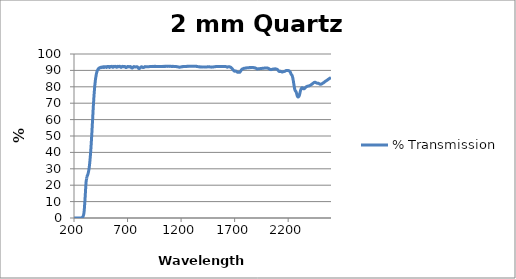
| Category | % Transmission |
|---|---|
| 2600.0 | 85.614 |
| 2599.0 | 85.567 |
| 2598.0 | 85.553 |
| 2597.0 | 85.533 |
| 2596.0 | 85.488 |
| 2595.0 | 85.441 |
| 2594.0 | 85.409 |
| 2593.0 | 85.367 |
| 2592.0 | 85.306 |
| 2591.0 | 85.269 |
| 2590.0 | 85.24 |
| 2589.0 | 85.201 |
| 2588.0 | 85.133 |
| 2587.0 | 85.096 |
| 2586.0 | 85.065 |
| 2585.0 | 85.046 |
| 2584.0 | 85.014 |
| 2583.0 | 84.96 |
| 2582.0 | 84.914 |
| 2581.0 | 84.849 |
| 2580.0 | 84.813 |
| 2579.0 | 84.771 |
| 2578.0 | 84.717 |
| 2577.0 | 84.67 |
| 2576.0 | 84.656 |
| 2575.0 | 84.606 |
| 2574.0 | 84.529 |
| 2573.0 | 84.483 |
| 2572.0 | 84.449 |
| 2571.0 | 84.373 |
| 2570.0 | 84.314 |
| 2569.0 | 84.259 |
| 2568.0 | 84.216 |
| 2567.0 | 84.174 |
| 2566.0 | 84.167 |
| 2565.0 | 84.11 |
| 2564.0 | 84.052 |
| 2563.0 | 84.034 |
| 2562.0 | 83.957 |
| 2561.0 | 83.891 |
| 2560.0 | 83.846 |
| 2559.0 | 83.817 |
| 2558.0 | 83.783 |
| 2557.0 | 83.774 |
| 2556.0 | 83.711 |
| 2555.0 | 83.677 |
| 2554.0 | 83.659 |
| 2553.0 | 83.614 |
| 2552.0 | 83.568 |
| 2551.0 | 83.537 |
| 2550.0 | 83.486 |
| 2549.0 | 83.431 |
| 2548.0 | 83.375 |
| 2547.0 | 83.309 |
| 2546.0 | 83.262 |
| 2545.0 | 83.224 |
| 2544.0 | 83.186 |
| 2543.0 | 83.152 |
| 2542.0 | 83.093 |
| 2541.0 | 83.016 |
| 2540.0 | 82.946 |
| 2539.0 | 82.89 |
| 2538.0 | 82.818 |
| 2537.0 | 82.803 |
| 2536.0 | 82.773 |
| 2535.0 | 82.689 |
| 2534.0 | 82.65 |
| 2533.0 | 82.607 |
| 2532.0 | 82.536 |
| 2531.0 | 82.507 |
| 2530.0 | 82.496 |
| 2529.0 | 82.452 |
| 2528.0 | 82.372 |
| 2527.0 | 82.332 |
| 2526.0 | 82.344 |
| 2525.0 | 82.303 |
| 2524.0 | 82.262 |
| 2523.0 | 82.205 |
| 2522.0 | 82.153 |
| 2521.0 | 82.114 |
| 2520.0 | 82.059 |
| 2519.0 | 82.009 |
| 2518.0 | 81.981 |
| 2517.0 | 81.955 |
| 2516.0 | 81.899 |
| 2515.0 | 81.85 |
| 2514.0 | 81.815 |
| 2513.0 | 81.774 |
| 2512.0 | 81.739 |
| 2511.0 | 81.691 |
| 2510.0 | 81.64 |
| 2509.0 | 81.621 |
| 2508.0 | 81.596 |
| 2507.0 | 81.584 |
| 2506.0 | 81.559 |
| 2505.0 | 81.56 |
| 2504.0 | 81.524 |
| 2503.0 | 81.506 |
| 2502.0 | 81.507 |
| 2501.0 | 81.507 |
| 2500.0 | 81.535 |
| 2499.0 | 81.54 |
| 2498.0 | 81.558 |
| 2497.0 | 81.595 |
| 2496.0 | 81.614 |
| 2495.0 | 81.634 |
| 2494.0 | 81.683 |
| 2493.0 | 81.718 |
| 2492.0 | 81.761 |
| 2491.0 | 81.799 |
| 2490.0 | 81.839 |
| 2489.0 | 81.879 |
| 2488.0 | 81.925 |
| 2487.0 | 81.98 |
| 2486.0 | 82.029 |
| 2485.0 | 82.075 |
| 2484.0 | 82.114 |
| 2483.0 | 82.147 |
| 2482.0 | 82.171 |
| 2481.0 | 82.215 |
| 2480.0 | 82.214 |
| 2479.0 | 82.214 |
| 2478.0 | 82.208 |
| 2477.0 | 82.232 |
| 2476.0 | 82.234 |
| 2475.0 | 82.223 |
| 2474.0 | 82.209 |
| 2473.0 | 82.215 |
| 2472.0 | 82.221 |
| 2471.0 | 82.217 |
| 2470.0 | 82.222 |
| 2469.0 | 82.25 |
| 2468.0 | 82.264 |
| 2467.0 | 82.279 |
| 2466.0 | 82.281 |
| 2465.0 | 82.303 |
| 2464.0 | 82.335 |
| 2463.0 | 82.379 |
| 2462.0 | 82.414 |
| 2461.0 | 82.452 |
| 2460.0 | 82.515 |
| 2459.0 | 82.556 |
| 2458.0 | 82.599 |
| 2457.0 | 82.633 |
| 2456.0 | 82.664 |
| 2455.0 | 82.707 |
| 2454.0 | 82.738 |
| 2453.0 | 82.752 |
| 2452.0 | 82.768 |
| 2451.0 | 82.776 |
| 2450.0 | 82.786 |
| 2449.0 | 82.776 |
| 2448.0 | 82.754 |
| 2447.0 | 82.732 |
| 2446.0 | 82.721 |
| 2445.0 | 82.707 |
| 2444.0 | 82.668 |
| 2443.0 | 82.626 |
| 2442.0 | 82.597 |
| 2441.0 | 82.566 |
| 2440.0 | 82.529 |
| 2439.0 | 82.506 |
| 2438.0 | 82.451 |
| 2437.0 | 82.401 |
| 2436.0 | 82.345 |
| 2435.0 | 82.293 |
| 2434.0 | 82.244 |
| 2433.0 | 82.178 |
| 2432.0 | 82.113 |
| 2431.0 | 82.076 |
| 2430.0 | 82.045 |
| 2429.0 | 82.003 |
| 2428.0 | 81.947 |
| 2427.0 | 81.883 |
| 2426.0 | 81.83 |
| 2425.0 | 81.783 |
| 2424.0 | 81.714 |
| 2423.0 | 81.664 |
| 2422.0 | 81.626 |
| 2421.0 | 81.568 |
| 2420.0 | 81.499 |
| 2419.0 | 81.448 |
| 2418.0 | 81.411 |
| 2417.0 | 81.367 |
| 2416.0 | 81.322 |
| 2415.0 | 81.281 |
| 2414.0 | 81.24 |
| 2413.0 | 81.206 |
| 2412.0 | 81.163 |
| 2411.0 | 81.113 |
| 2410.0 | 81.073 |
| 2409.0 | 81.035 |
| 2408.0 | 80.98 |
| 2407.0 | 80.927 |
| 2406.0 | 80.899 |
| 2405.0 | 80.858 |
| 2404.0 | 80.806 |
| 2403.0 | 80.78 |
| 2402.0 | 80.764 |
| 2401.0 | 80.75 |
| 2400.0 | 80.726 |
| 2399.0 | 80.689 |
| 2398.0 | 80.661 |
| 2397.0 | 80.628 |
| 2396.0 | 80.6 |
| 2395.0 | 80.568 |
| 2394.0 | 80.548 |
| 2393.0 | 80.541 |
| 2392.0 | 80.528 |
| 2391.0 | 80.522 |
| 2390.0 | 80.516 |
| 2389.0 | 80.494 |
| 2388.0 | 80.484 |
| 2387.0 | 80.47 |
| 2386.0 | 80.45 |
| 2385.0 | 80.433 |
| 2384.0 | 80.42 |
| 2383.0 | 80.404 |
| 2382.0 | 80.385 |
| 2381.0 | 80.374 |
| 2380.0 | 80.358 |
| 2379.0 | 80.325 |
| 2378.0 | 80.305 |
| 2377.0 | 80.272 |
| 2376.0 | 80.248 |
| 2375.0 | 80.22 |
| 2374.0 | 80.187 |
| 2373.0 | 80.154 |
| 2372.0 | 80.114 |
| 2371.0 | 80.075 |
| 2370.0 | 80.037 |
| 2369.0 | 79.986 |
| 2368.0 | 79.923 |
| 2367.0 | 79.862 |
| 2366.0 | 79.812 |
| 2365.0 | 79.757 |
| 2364.0 | 79.707 |
| 2363.0 | 79.662 |
| 2362.0 | 79.591 |
| 2361.0 | 79.531 |
| 2360.0 | 79.472 |
| 2359.0 | 79.412 |
| 2358.0 | 79.339 |
| 2357.0 | 79.262 |
| 2356.0 | 79.187 |
| 2355.0 | 79.122 |
| 2354.0 | 79.057 |
| 2353.0 | 78.972 |
| 2352.0 | 78.922 |
| 2351.0 | 78.88 |
| 2350.0 | 78.84 |
| 2349.0 | 78.807 |
| 2348.0 | 78.776 |
| 2347.0 | 78.764 |
| 2346.0 | 78.775 |
| 2345.0 | 78.793 |
| 2344.0 | 78.819 |
| 2343.0 | 78.857 |
| 2342.0 | 78.897 |
| 2341.0 | 78.951 |
| 2340.0 | 79.015 |
| 2339.0 | 79.076 |
| 2338.0 | 79.145 |
| 2337.0 | 79.205 |
| 2336.0 | 79.278 |
| 2335.0 | 79.335 |
| 2334.0 | 79.374 |
| 2333.0 | 79.428 |
| 2332.0 | 79.461 |
| 2331.0 | 79.448 |
| 2330.0 | 79.45 |
| 2329.0 | 79.439 |
| 2328.0 | 79.384 |
| 2327.0 | 79.304 |
| 2326.0 | 79.233 |
| 2325.0 | 79.158 |
| 2324.0 | 79.063 |
| 2323.0 | 78.947 |
| 2322.0 | 78.795 |
| 2321.0 | 78.634 |
| 2320.0 | 78.477 |
| 2319.0 | 78.323 |
| 2318.0 | 78.164 |
| 2317.0 | 77.981 |
| 2316.0 | 77.787 |
| 2315.0 | 77.562 |
| 2314.0 | 77.328 |
| 2313.0 | 77.095 |
| 2312.0 | 76.825 |
| 2311.0 | 76.532 |
| 2310.0 | 76.237 |
| 2309.0 | 75.963 |
| 2308.0 | 75.708 |
| 2307.0 | 75.42 |
| 2306.0 | 75.173 |
| 2305.0 | 74.923 |
| 2304.0 | 74.712 |
| 2303.0 | 74.514 |
| 2302.0 | 74.376 |
| 2301.0 | 74.231 |
| 2300.0 | 74.111 |
| 2299.0 | 74.02 |
| 2298.0 | 73.954 |
| 2297.0 | 73.89 |
| 2296.0 | 73.844 |
| 2295.0 | 73.802 |
| 2294.0 | 73.802 |
| 2293.0 | 73.792 |
| 2292.0 | 73.803 |
| 2291.0 | 73.839 |
| 2290.0 | 73.892 |
| 2289.0 | 73.947 |
| 2288.0 | 74.035 |
| 2287.0 | 74.132 |
| 2286.0 | 74.269 |
| 2285.0 | 74.428 |
| 2284.0 | 74.611 |
| 2283.0 | 74.841 |
| 2282.0 | 75.067 |
| 2281.0 | 75.31 |
| 2280.0 | 75.572 |
| 2279.0 | 75.842 |
| 2278.0 | 76.09 |
| 2277.0 | 76.343 |
| 2276.0 | 76.568 |
| 2275.0 | 76.755 |
| 2274.0 | 76.942 |
| 2273.0 | 77.082 |
| 2272.0 | 77.202 |
| 2271.0 | 77.308 |
| 2270.0 | 77.39 |
| 2269.0 | 77.448 |
| 2268.0 | 77.504 |
| 2267.0 | 77.584 |
| 2266.0 | 77.683 |
| 2265.0 | 77.805 |
| 2264.0 | 77.972 |
| 2263.0 | 78.133 |
| 2262.0 | 78.36 |
| 2261.0 | 78.61 |
| 2260.0 | 78.889 |
| 2259.0 | 79.245 |
| 2258.0 | 79.585 |
| 2257.0 | 79.981 |
| 2256.0 | 80.369 |
| 2255.0 | 80.781 |
| 2254.0 | 81.17 |
| 2253.0 | 81.617 |
| 2252.0 | 82.031 |
| 2251.0 | 82.445 |
| 2250.0 | 82.866 |
| 2249.0 | 83.272 |
| 2248.0 | 83.648 |
| 2247.0 | 84.019 |
| 2246.0 | 84.388 |
| 2245.0 | 84.823 |
| 2244.0 | 85.151 |
| 2243.0 | 85.458 |
| 2242.0 | 85.762 |
| 2241.0 | 86.006 |
| 2240.0 | 86.222 |
| 2239.0 | 86.47 |
| 2238.0 | 86.65 |
| 2237.0 | 86.816 |
| 2236.0 | 86.956 |
| 2235.0 | 87.064 |
| 2234.0 | 87.147 |
| 2233.0 | 87.213 |
| 2232.0 | 87.281 |
| 2231.0 | 87.389 |
| 2230.0 | 87.475 |
| 2229.0 | 87.577 |
| 2228.0 | 87.659 |
| 2227.0 | 87.819 |
| 2226.0 | 87.971 |
| 2225.0 | 88.121 |
| 2224.0 | 88.291 |
| 2223.0 | 88.451 |
| 2222.0 | 88.585 |
| 2221.0 | 88.721 |
| 2220.0 | 88.843 |
| 2219.0 | 88.972 |
| 2218.0 | 89.091 |
| 2217.0 | 89.19 |
| 2216.0 | 89.288 |
| 2215.0 | 89.356 |
| 2214.0 | 89.444 |
| 2213.0 | 89.48 |
| 2212.0 | 89.543 |
| 2211.0 | 89.622 |
| 2210.0 | 89.648 |
| 2209.0 | 89.722 |
| 2208.0 | 89.748 |
| 2207.0 | 89.779 |
| 2206.0 | 89.808 |
| 2205.0 | 89.829 |
| 2204.0 | 89.827 |
| 2203.0 | 89.858 |
| 2202.0 | 89.888 |
| 2201.0 | 89.911 |
| 2200.0 | 89.907 |
| 2199.0 | 89.936 |
| 2198.0 | 89.926 |
| 2197.0 | 89.925 |
| 2196.0 | 89.959 |
| 2195.0 | 89.977 |
| 2194.0 | 89.945 |
| 2193.0 | 89.96 |
| 2192.0 | 89.972 |
| 2191.0 | 89.943 |
| 2190.0 | 89.938 |
| 2189.0 | 89.938 |
| 2188.0 | 89.943 |
| 2187.0 | 89.913 |
| 2186.0 | 89.922 |
| 2185.0 | 89.893 |
| 2184.0 | 89.898 |
| 2183.0 | 89.883 |
| 2182.0 | 89.885 |
| 2181.0 | 89.877 |
| 2180.0 | 89.84 |
| 2179.0 | 89.839 |
| 2178.0 | 89.81 |
| 2177.0 | 89.794 |
| 2176.0 | 89.763 |
| 2175.0 | 89.696 |
| 2174.0 | 89.681 |
| 2173.0 | 89.621 |
| 2172.0 | 89.613 |
| 2171.0 | 89.525 |
| 2170.0 | 89.492 |
| 2169.0 | 89.462 |
| 2168.0 | 89.438 |
| 2167.0 | 89.443 |
| 2166.0 | 89.399 |
| 2165.0 | 89.372 |
| 2164.0 | 89.383 |
| 2163.0 | 89.388 |
| 2162.0 | 89.37 |
| 2161.0 | 89.323 |
| 2160.0 | 89.317 |
| 2159.0 | 89.304 |
| 2158.0 | 89.304 |
| 2157.0 | 89.274 |
| 2156.0 | 89.237 |
| 2155.0 | 89.209 |
| 2154.0 | 89.175 |
| 2153.0 | 89.184 |
| 2152.0 | 89.127 |
| 2151.0 | 89.116 |
| 2150.0 | 89.105 |
| 2149.0 | 89.066 |
| 2148.0 | 89.049 |
| 2147.0 | 89.057 |
| 2146.0 | 89.042 |
| 2145.0 | 89.033 |
| 2144.0 | 89.026 |
| 2143.0 | 89.013 |
| 2142.0 | 89.077 |
| 2141.0 | 89.084 |
| 2140.0 | 89.116 |
| 2139.0 | 89.138 |
| 2138.0 | 89.176 |
| 2137.0 | 89.222 |
| 2136.0 | 89.268 |
| 2135.0 | 89.279 |
| 2134.0 | 89.314 |
| 2133.0 | 89.337 |
| 2132.0 | 89.389 |
| 2131.0 | 89.412 |
| 2130.0 | 89.421 |
| 2129.0 | 89.443 |
| 2128.0 | 89.456 |
| 2127.0 | 89.453 |
| 2126.0 | 89.394 |
| 2125.0 | 89.399 |
| 2124.0 | 89.407 |
| 2123.0 | 89.408 |
| 2122.0 | 89.395 |
| 2121.0 | 89.404 |
| 2120.0 | 89.391 |
| 2119.0 | 89.385 |
| 2118.0 | 89.377 |
| 2117.0 | 89.394 |
| 2116.0 | 89.383 |
| 2115.0 | 89.423 |
| 2114.0 | 89.457 |
| 2113.0 | 89.498 |
| 2112.0 | 89.55 |
| 2111.0 | 89.622 |
| 2110.0 | 89.709 |
| 2109.0 | 89.802 |
| 2108.0 | 89.896 |
| 2107.0 | 89.994 |
| 2106.0 | 90.066 |
| 2105.0 | 90.15 |
| 2104.0 | 90.227 |
| 2103.0 | 90.321 |
| 2102.0 | 90.395 |
| 2101.0 | 90.434 |
| 2100.0 | 90.492 |
| 2099.0 | 90.553 |
| 2098.0 | 90.616 |
| 2097.0 | 90.651 |
| 2096.0 | 90.645 |
| 2095.0 | 90.687 |
| 2094.0 | 90.713 |
| 2093.0 | 90.752 |
| 2092.0 | 90.781 |
| 2091.0 | 90.775 |
| 2090.0 | 90.796 |
| 2089.0 | 90.837 |
| 2088.0 | 90.859 |
| 2087.0 | 90.881 |
| 2086.0 | 90.897 |
| 2085.0 | 90.887 |
| 2084.0 | 90.915 |
| 2083.0 | 90.924 |
| 2082.0 | 90.937 |
| 2081.0 | 90.959 |
| 2080.0 | 90.94 |
| 2079.0 | 90.937 |
| 2078.0 | 90.94 |
| 2077.0 | 90.966 |
| 2076.0 | 90.969 |
| 2075.0 | 90.926 |
| 2074.0 | 90.917 |
| 2073.0 | 90.925 |
| 2072.0 | 90.924 |
| 2071.0 | 90.924 |
| 2070.0 | 90.914 |
| 2069.0 | 90.9 |
| 2068.0 | 90.886 |
| 2067.0 | 90.893 |
| 2066.0 | 90.905 |
| 2065.0 | 90.874 |
| 2064.0 | 90.843 |
| 2063.0 | 90.855 |
| 2062.0 | 90.867 |
| 2061.0 | 90.859 |
| 2060.0 | 90.836 |
| 2059.0 | 90.806 |
| 2058.0 | 90.799 |
| 2057.0 | 90.793 |
| 2056.0 | 90.783 |
| 2055.0 | 90.729 |
| 2054.0 | 90.69 |
| 2053.0 | 90.69 |
| 2052.0 | 90.678 |
| 2051.0 | 90.642 |
| 2050.0 | 90.63 |
| 2049.0 | 90.604 |
| 2048.0 | 90.595 |
| 2047.0 | 90.585 |
| 2046.0 | 90.565 |
| 2045.0 | 90.535 |
| 2044.0 | 90.512 |
| 2043.0 | 90.509 |
| 2042.0 | 90.485 |
| 2041.0 | 90.473 |
| 2040.0 | 90.464 |
| 2039.0 | 90.451 |
| 2038.0 | 90.471 |
| 2037.0 | 90.48 |
| 2036.0 | 90.479 |
| 2035.0 | 90.488 |
| 2034.0 | 90.509 |
| 2033.0 | 90.523 |
| 2032.0 | 90.546 |
| 2031.0 | 90.578 |
| 2030.0 | 90.609 |
| 2029.0 | 90.653 |
| 2028.0 | 90.691 |
| 2027.0 | 90.754 |
| 2026.0 | 90.805 |
| 2025.0 | 90.835 |
| 2024.0 | 90.9 |
| 2023.0 | 90.946 |
| 2022.0 | 90.995 |
| 2021.0 | 91.036 |
| 2020.0 | 91.05 |
| 2019.0 | 91.078 |
| 2018.0 | 91.138 |
| 2017.0 | 91.184 |
| 2016.0 | 91.206 |
| 2015.0 | 91.242 |
| 2014.0 | 91.278 |
| 2013.0 | 91.3 |
| 2012.0 | 91.32 |
| 2011.0 | 91.326 |
| 2010.0 | 91.337 |
| 2009.0 | 91.361 |
| 2008.0 | 91.379 |
| 2007.0 | 91.41 |
| 2006.0 | 91.439 |
| 2005.0 | 91.446 |
| 2004.0 | 91.451 |
| 2003.0 | 91.456 |
| 2002.0 | 91.459 |
| 2001.0 | 91.478 |
| 2000.0 | 91.508 |
| 1999.0 | 91.518 |
| 1998.0 | 91.498 |
| 1997.0 | 91.502 |
| 1996.0 | 91.507 |
| 1995.0 | 91.49 |
| 1994.0 | 91.501 |
| 1993.0 | 91.495 |
| 1992.0 | 91.485 |
| 1991.0 | 91.456 |
| 1990.0 | 91.443 |
| 1989.0 | 91.457 |
| 1988.0 | 91.462 |
| 1987.0 | 91.458 |
| 1986.0 | 91.443 |
| 1985.0 | 91.428 |
| 1984.0 | 91.419 |
| 1983.0 | 91.406 |
| 1982.0 | 91.409 |
| 1981.0 | 91.408 |
| 1980.0 | 91.396 |
| 1979.0 | 91.388 |
| 1978.0 | 91.401 |
| 1977.0 | 91.399 |
| 1976.0 | 91.381 |
| 1975.0 | 91.377 |
| 1974.0 | 91.358 |
| 1973.0 | 91.352 |
| 1972.0 | 91.359 |
| 1971.0 | 91.368 |
| 1970.0 | 91.377 |
| 1969.0 | 91.372 |
| 1968.0 | 91.349 |
| 1967.0 | 91.331 |
| 1966.0 | 91.32 |
| 1965.0 | 91.328 |
| 1964.0 | 91.329 |
| 1963.0 | 91.3 |
| 1962.0 | 91.289 |
| 1961.0 | 91.288 |
| 1960.0 | 91.277 |
| 1959.0 | 91.255 |
| 1958.0 | 91.262 |
| 1957.0 | 91.25 |
| 1956.0 | 91.212 |
| 1955.0 | 91.197 |
| 1954.0 | 91.225 |
| 1953.0 | 91.189 |
| 1952.0 | 91.161 |
| 1951.0 | 91.16 |
| 1950.0 | 91.181 |
| 1949.0 | 91.156 |
| 1948.0 | 91.18 |
| 1947.0 | 91.174 |
| 1946.0 | 91.13 |
| 1945.0 | 91.137 |
| 1944.0 | 91.141 |
| 1943.0 | 91.13 |
| 1942.0 | 91.119 |
| 1941.0 | 91.12 |
| 1940.0 | 91.123 |
| 1939.0 | 91.08 |
| 1938.0 | 91.093 |
| 1937.0 | 91.096 |
| 1936.0 | 91.082 |
| 1935.0 | 91.067 |
| 1934.0 | 91.067 |
| 1933.0 | 91.053 |
| 1932.0 | 91.021 |
| 1931.0 | 91.024 |
| 1930.0 | 91.016 |
| 1929.0 | 90.984 |
| 1928.0 | 91.001 |
| 1927.0 | 90.985 |
| 1926.0 | 90.972 |
| 1925.0 | 90.972 |
| 1924.0 | 90.968 |
| 1923.0 | 90.972 |
| 1922.0 | 90.966 |
| 1921.0 | 90.967 |
| 1920.0 | 90.956 |
| 1919.0 | 90.955 |
| 1918.0 | 90.929 |
| 1917.0 | 90.924 |
| 1916.0 | 90.928 |
| 1915.0 | 90.91 |
| 1914.0 | 90.915 |
| 1913.0 | 90.92 |
| 1912.0 | 90.907 |
| 1911.0 | 90.903 |
| 1910.0 | 90.936 |
| 1909.0 | 90.968 |
| 1908.0 | 90.991 |
| 1907.0 | 91.013 |
| 1906.0 | 91.005 |
| 1905.0 | 91.044 |
| 1904.0 | 91.094 |
| 1903.0 | 91.118 |
| 1902.0 | 91.155 |
| 1901.0 | 91.185 |
| 1900.0 | 91.227 |
| 1899.0 | 91.28 |
| 1898.0 | 91.342 |
| 1897.0 | 91.37 |
| 1896.0 | 91.381 |
| 1895.0 | 91.414 |
| 1894.0 | 91.444 |
| 1893.0 | 91.51 |
| 1892.0 | 91.504 |
| 1891.0 | 91.487 |
| 1890.0 | 91.54 |
| 1889.0 | 91.569 |
| 1888.0 | 91.57 |
| 1887.0 | 91.593 |
| 1886.0 | 91.609 |
| 1885.0 | 91.646 |
| 1884.0 | 91.655 |
| 1883.0 | 91.658 |
| 1882.0 | 91.671 |
| 1881.0 | 91.683 |
| 1880.0 | 91.675 |
| 1879.0 | 91.681 |
| 1878.0 | 91.683 |
| 1877.0 | 91.706 |
| 1876.0 | 91.717 |
| 1875.0 | 91.711 |
| 1874.0 | 91.73 |
| 1873.0 | 91.694 |
| 1872.0 | 91.7 |
| 1871.0 | 91.715 |
| 1870.0 | 91.743 |
| 1869.0 | 91.739 |
| 1868.0 | 91.764 |
| 1867.0 | 91.816 |
| 1866.0 | 91.806 |
| 1865.0 | 91.792 |
| 1864.0 | 91.775 |
| 1863.0 | 91.788 |
| 1862.0 | 91.784 |
| 1861.0 | 91.771 |
| 1860.0 | 91.757 |
| 1859.0 | 91.724 |
| 1858.0 | 91.763 |
| 1857.0 | 91.764 |
| 1856.0 | 91.763 |
| 1855.0 | 91.743 |
| 1854.0 | 91.761 |
| 1853.0 | 91.751 |
| 1852.0 | 91.75 |
| 1851.0 | 91.735 |
| 1850.0 | 91.691 |
| 1849.0 | 91.733 |
| 1848.0 | 91.724 |
| 1847.0 | 91.715 |
| 1846.0 | 91.719 |
| 1845.0 | 91.75 |
| 1844.0 | 91.698 |
| 1843.0 | 91.673 |
| 1842.0 | 91.707 |
| 1841.0 | 91.685 |
| 1840.0 | 91.705 |
| 1839.0 | 91.72 |
| 1838.0 | 91.71 |
| 1837.0 | 91.669 |
| 1836.0 | 91.667 |
| 1835.0 | 91.658 |
| 1834.0 | 91.658 |
| 1833.0 | 91.663 |
| 1832.0 | 91.661 |
| 1831.0 | 91.663 |
| 1830.0 | 91.667 |
| 1829.0 | 91.664 |
| 1828.0 | 91.635 |
| 1827.0 | 91.66 |
| 1826.0 | 91.602 |
| 1825.0 | 91.64 |
| 1824.0 | 91.634 |
| 1823.0 | 91.6 |
| 1822.0 | 91.577 |
| 1821.0 | 91.587 |
| 1820.0 | 91.576 |
| 1819.0 | 91.583 |
| 1818.0 | 91.583 |
| 1817.0 | 91.587 |
| 1816.0 | 91.612 |
| 1815.0 | 91.564 |
| 1814.0 | 91.574 |
| 1813.0 | 91.543 |
| 1812.0 | 91.511 |
| 1811.0 | 91.504 |
| 1810.0 | 91.49 |
| 1809.0 | 91.505 |
| 1808.0 | 91.498 |
| 1807.0 | 91.46 |
| 1806.0 | 91.445 |
| 1805.0 | 91.441 |
| 1804.0 | 91.454 |
| 1803.0 | 91.459 |
| 1802.0 | 91.42 |
| 1801.0 | 91.398 |
| 1800.0 | 91.376 |
| 1799.0 | 91.361 |
| 1798.0 | 91.376 |
| 1797.0 | 91.377 |
| 1796.0 | 91.383 |
| 1795.0 | 91.345 |
| 1794.0 | 91.304 |
| 1793.0 | 91.325 |
| 1792.0 | 91.286 |
| 1791.0 | 91.265 |
| 1790.0 | 91.259 |
| 1789.0 | 91.286 |
| 1788.0 | 91.275 |
| 1787.0 | 91.256 |
| 1786.0 | 91.213 |
| 1785.0 | 91.195 |
| 1784.0 | 91.167 |
| 1783.0 | 91.136 |
| 1782.0 | 91.141 |
| 1781.0 | 91.088 |
| 1780.0 | 91.07 |
| 1779.0 | 91.016 |
| 1778.0 | 91.015 |
| 1777.0 | 90.986 |
| 1776.0 | 90.946 |
| 1775.0 | 90.888 |
| 1774.0 | 90.884 |
| 1773.0 | 90.863 |
| 1772.0 | 90.814 |
| 1771.0 | 90.797 |
| 1770.0 | 90.77 |
| 1769.0 | 90.698 |
| 1768.0 | 90.625 |
| 1767.0 | 90.552 |
| 1766.0 | 90.477 |
| 1765.0 | 90.413 |
| 1764.0 | 90.316 |
| 1763.0 | 90.232 |
| 1762.0 | 90.184 |
| 1761.0 | 90.068 |
| 1760.0 | 89.964 |
| 1759.0 | 89.859 |
| 1758.0 | 89.753 |
| 1757.0 | 89.644 |
| 1756.0 | 89.546 |
| 1755.0 | 89.45 |
| 1754.0 | 89.347 |
| 1753.0 | 89.226 |
| 1752.0 | 89.138 |
| 1751.0 | 89.063 |
| 1750.0 | 88.998 |
| 1749.0 | 88.925 |
| 1748.0 | 88.872 |
| 1747.0 | 88.825 |
| 1746.0 | 88.82 |
| 1745.0 | 88.83 |
| 1744.0 | 88.814 |
| 1743.0 | 88.82 |
| 1742.0 | 88.824 |
| 1741.0 | 88.831 |
| 1740.0 | 88.825 |
| 1739.0 | 88.856 |
| 1738.0 | 88.884 |
| 1737.0 | 88.903 |
| 1736.0 | 88.896 |
| 1735.0 | 88.901 |
| 1734.0 | 88.884 |
| 1733.0 | 88.877 |
| 1732.0 | 88.896 |
| 1731.0 | 88.887 |
| 1730.0 | 88.888 |
| 1729.0 | 88.911 |
| 1728.0 | 88.902 |
| 1727.0 | 88.913 |
| 1726.0 | 88.926 |
| 1725.0 | 88.957 |
| 1724.0 | 89.008 |
| 1723.0 | 89.045 |
| 1722.0 | 89.083 |
| 1721.0 | 89.105 |
| 1720.0 | 89.162 |
| 1719.0 | 89.208 |
| 1718.0 | 89.255 |
| 1717.0 | 89.301 |
| 1716.0 | 89.368 |
| 1715.0 | 89.431 |
| 1714.0 | 89.486 |
| 1713.0 | 89.528 |
| 1712.0 | 89.558 |
| 1711.0 | 89.58 |
| 1710.0 | 89.59 |
| 1709.0 | 89.597 |
| 1708.0 | 89.604 |
| 1707.0 | 89.603 |
| 1706.0 | 89.605 |
| 1705.0 | 89.6 |
| 1704.0 | 89.561 |
| 1703.0 | 89.558 |
| 1702.0 | 89.543 |
| 1701.0 | 89.545 |
| 1700.0 | 89.528 |
| 1699.0 | 89.542 |
| 1698.0 | 89.559 |
| 1697.0 | 89.572 |
| 1696.0 | 89.606 |
| 1695.0 | 89.656 |
| 1694.0 | 89.712 |
| 1693.0 | 89.793 |
| 1692.0 | 89.865 |
| 1691.0 | 89.941 |
| 1690.0 | 90.04 |
| 1689.0 | 90.131 |
| 1688.0 | 90.198 |
| 1687.0 | 90.277 |
| 1686.0 | 90.373 |
| 1685.0 | 90.457 |
| 1684.0 | 90.513 |
| 1683.0 | 90.568 |
| 1682.0 | 90.638 |
| 1681.0 | 90.714 |
| 1680.0 | 90.802 |
| 1679.0 | 90.876 |
| 1678.0 | 90.921 |
| 1677.0 | 90.983 |
| 1676.0 | 91.058 |
| 1675.0 | 91.137 |
| 1674.0 | 91.202 |
| 1673.0 | 91.277 |
| 1672.0 | 91.352 |
| 1671.0 | 91.446 |
| 1670.0 | 91.526 |
| 1669.0 | 91.594 |
| 1668.0 | 91.673 |
| 1667.0 | 91.722 |
| 1666.0 | 91.763 |
| 1665.0 | 91.827 |
| 1664.0 | 91.907 |
| 1663.0 | 91.944 |
| 1662.0 | 91.978 |
| 1661.0 | 92.007 |
| 1660.0 | 92.028 |
| 1659.0 | 92.05 |
| 1658.0 | 92.078 |
| 1657.0 | 92.113 |
| 1656.0 | 92.137 |
| 1655.0 | 92.152 |
| 1654.0 | 92.137 |
| 1653.0 | 92.133 |
| 1652.0 | 92.176 |
| 1651.0 | 92.194 |
| 1650.0 | 92.188 |
| 1649.0 | 92.196 |
| 1648.0 | 92.198 |
| 1647.0 | 92.228 |
| 1646.0 | 92.244 |
| 1645.0 | 92.25 |
| 1644.0 | 92.247 |
| 1643.0 | 92.232 |
| 1642.0 | 92.241 |
| 1641.0 | 92.224 |
| 1640.0 | 92.196 |
| 1639.0 | 92.198 |
| 1638.0 | 92.184 |
| 1637.0 | 92.13 |
| 1636.0 | 92.099 |
| 1635.0 | 92.073 |
| 1634.0 | 92.026 |
| 1633.0 | 91.982 |
| 1632.0 | 91.949 |
| 1631.0 | 91.949 |
| 1630.0 | 91.999 |
| 1629.0 | 92.042 |
| 1628.0 | 92.067 |
| 1627.0 | 92.093 |
| 1626.0 | 92.115 |
| 1625.0 | 92.129 |
| 1624.0 | 92.156 |
| 1623.0 | 92.195 |
| 1622.0 | 92.228 |
| 1621.0 | 92.259 |
| 1620.0 | 92.279 |
| 1619.0 | 92.3 |
| 1618.0 | 92.302 |
| 1617.0 | 92.309 |
| 1616.0 | 92.314 |
| 1615.0 | 92.314 |
| 1614.0 | 92.319 |
| 1613.0 | 92.328 |
| 1612.0 | 92.33 |
| 1611.0 | 92.347 |
| 1610.0 | 92.353 |
| 1609.0 | 92.343 |
| 1608.0 | 92.346 |
| 1607.0 | 92.343 |
| 1606.0 | 92.345 |
| 1605.0 | 92.36 |
| 1604.0 | 92.367 |
| 1603.0 | 92.365 |
| 1602.0 | 92.347 |
| 1601.0 | 92.351 |
| 1600.0 | 92.367 |
| 1599.0 | 92.36 |
| 1598.0 | 92.355 |
| 1597.0 | 92.361 |
| 1596.0 | 92.334 |
| 1595.0 | 92.335 |
| 1594.0 | 92.34 |
| 1593.0 | 92.348 |
| 1592.0 | 92.353 |
| 1591.0 | 92.358 |
| 1590.0 | 92.365 |
| 1589.0 | 92.363 |
| 1588.0 | 92.351 |
| 1587.0 | 92.344 |
| 1586.0 | 92.343 |
| 1585.0 | 92.362 |
| 1584.0 | 92.35 |
| 1583.0 | 92.373 |
| 1582.0 | 92.386 |
| 1581.0 | 92.362 |
| 1580.0 | 92.362 |
| 1579.0 | 92.343 |
| 1578.0 | 92.339 |
| 1577.0 | 92.351 |
| 1576.0 | 92.338 |
| 1575.0 | 92.348 |
| 1574.0 | 92.365 |
| 1573.0 | 92.351 |
| 1572.0 | 92.346 |
| 1571.0 | 92.357 |
| 1570.0 | 92.364 |
| 1569.0 | 92.349 |
| 1568.0 | 92.361 |
| 1567.0 | 92.385 |
| 1566.0 | 92.391 |
| 1565.0 | 92.378 |
| 1564.0 | 92.366 |
| 1563.0 | 92.386 |
| 1562.0 | 92.391 |
| 1561.0 | 92.409 |
| 1560.0 | 92.395 |
| 1559.0 | 92.386 |
| 1558.0 | 92.394 |
| 1557.0 | 92.384 |
| 1556.0 | 92.389 |
| 1555.0 | 92.418 |
| 1554.0 | 92.397 |
| 1553.0 | 92.377 |
| 1552.0 | 92.403 |
| 1551.0 | 92.408 |
| 1550.0 | 92.409 |
| 1549.0 | 92.415 |
| 1548.0 | 92.434 |
| 1547.0 | 92.435 |
| 1546.0 | 92.408 |
| 1545.0 | 92.414 |
| 1544.0 | 92.404 |
| 1543.0 | 92.394 |
| 1542.0 | 92.389 |
| 1541.0 | 92.384 |
| 1540.0 | 92.403 |
| 1539.0 | 92.428 |
| 1538.0 | 92.428 |
| 1537.0 | 92.433 |
| 1536.0 | 92.418 |
| 1535.0 | 92.402 |
| 1534.0 | 92.4 |
| 1533.0 | 92.37 |
| 1532.0 | 92.351 |
| 1531.0 | 92.353 |
| 1530.0 | 92.352 |
| 1529.0 | 92.352 |
| 1528.0 | 92.338 |
| 1527.0 | 92.356 |
| 1526.0 | 92.36 |
| 1525.0 | 92.344 |
| 1524.0 | 92.329 |
| 1523.0 | 92.329 |
| 1522.0 | 92.308 |
| 1521.0 | 92.309 |
| 1520.0 | 92.262 |
| 1519.0 | 92.246 |
| 1518.0 | 92.257 |
| 1517.0 | 92.262 |
| 1516.0 | 92.247 |
| 1515.0 | 92.237 |
| 1514.0 | 92.258 |
| 1513.0 | 92.19 |
| 1512.0 | 92.188 |
| 1511.0 | 92.191 |
| 1510.0 | 92.184 |
| 1509.0 | 92.152 |
| 1508.0 | 92.15 |
| 1507.0 | 92.154 |
| 1506.0 | 92.158 |
| 1505.0 | 92.152 |
| 1504.0 | 92.114 |
| 1503.0 | 92.111 |
| 1502.0 | 92.118 |
| 1501.0 | 92.088 |
| 1500.0 | 92.085 |
| 1499.0 | 92.054 |
| 1498.0 | 92.076 |
| 1497.0 | 92.079 |
| 1496.0 | 92.087 |
| 1495.0 | 92.072 |
| 1494.0 | 92.033 |
| 1493.0 | 92.032 |
| 1492.0 | 92.018 |
| 1491.0 | 92.029 |
| 1490.0 | 92.011 |
| 1489.0 | 92.021 |
| 1488.0 | 92.015 |
| 1487.0 | 92.004 |
| 1486.0 | 92.022 |
| 1485.0 | 91.986 |
| 1484.0 | 91.997 |
| 1483.0 | 91.991 |
| 1482.0 | 92.003 |
| 1481.0 | 92.007 |
| 1480.0 | 92.027 |
| 1479.0 | 92.029 |
| 1478.0 | 92.034 |
| 1477.0 | 92.027 |
| 1476.0 | 92.057 |
| 1475.0 | 92.054 |
| 1474.0 | 92.042 |
| 1473.0 | 92.056 |
| 1472.0 | 92.058 |
| 1471.0 | 92.076 |
| 1470.0 | 92.137 |
| 1469.0 | 92.151 |
| 1468.0 | 92.146 |
| 1467.0 | 92.172 |
| 1466.0 | 92.174 |
| 1465.0 | 92.176 |
| 1464.0 | 92.198 |
| 1463.0 | 92.177 |
| 1462.0 | 92.19 |
| 1461.0 | 92.178 |
| 1460.0 | 92.163 |
| 1459.0 | 92.175 |
| 1458.0 | 92.208 |
| 1457.0 | 92.172 |
| 1456.0 | 92.17 |
| 1455.0 | 92.162 |
| 1454.0 | 92.162 |
| 1453.0 | 92.146 |
| 1452.0 | 92.171 |
| 1451.0 | 92.161 |
| 1450.0 | 92.163 |
| 1449.0 | 92.195 |
| 1448.0 | 92.196 |
| 1447.0 | 92.169 |
| 1446.0 | 92.179 |
| 1445.0 | 92.149 |
| 1444.0 | 92.141 |
| 1443.0 | 92.109 |
| 1442.0 | 92.125 |
| 1441.0 | 92.108 |
| 1440.0 | 92.09 |
| 1439.0 | 92.105 |
| 1438.0 | 92.116 |
| 1437.0 | 92.119 |
| 1436.0 | 92.116 |
| 1435.0 | 92.104 |
| 1434.0 | 92.071 |
| 1433.0 | 92.085 |
| 1432.0 | 92.109 |
| 1431.0 | 92.104 |
| 1430.0 | 92.096 |
| 1429.0 | 92.083 |
| 1428.0 | 92.079 |
| 1427.0 | 92.069 |
| 1426.0 | 92.061 |
| 1425.0 | 92.046 |
| 1424.0 | 92.078 |
| 1423.0 | 92.063 |
| 1422.0 | 92.088 |
| 1421.0 | 92.089 |
| 1420.0 | 92.093 |
| 1419.0 | 92.094 |
| 1418.0 | 92.092 |
| 1417.0 | 92.081 |
| 1416.0 | 92.077 |
| 1415.0 | 92.063 |
| 1414.0 | 92.074 |
| 1413.0 | 92.094 |
| 1412.0 | 92.088 |
| 1411.0 | 92.079 |
| 1410.0 | 92.1 |
| 1409.0 | 92.093 |
| 1408.0 | 92.095 |
| 1407.0 | 92.078 |
| 1406.0 | 92.089 |
| 1405.0 | 92.074 |
| 1404.0 | 92.074 |
| 1403.0 | 92.08 |
| 1402.0 | 92.1 |
| 1401.0 | 92.033 |
| 1400.0 | 92.08 |
| 1399.0 | 92.102 |
| 1398.0 | 92.076 |
| 1397.0 | 92.04 |
| 1396.0 | 92.072 |
| 1395.0 | 92.036 |
| 1394.0 | 92.093 |
| 1393.0 | 92.074 |
| 1392.0 | 92.056 |
| 1391.0 | 92.096 |
| 1390.0 | 92.153 |
| 1389.0 | 92.053 |
| 1388.0 | 92.075 |
| 1387.0 | 92.081 |
| 1386.0 | 92.092 |
| 1385.0 | 92.065 |
| 1384.0 | 92.071 |
| 1383.0 | 92.098 |
| 1382.0 | 92.052 |
| 1381.0 | 92.105 |
| 1380.0 | 92.137 |
| 1379.0 | 92.141 |
| 1378.0 | 92.173 |
| 1377.0 | 92.133 |
| 1376.0 | 92.081 |
| 1375.0 | 92.115 |
| 1374.0 | 92.126 |
| 1373.0 | 92.139 |
| 1372.0 | 92.166 |
| 1371.0 | 92.215 |
| 1370.0 | 92.197 |
| 1369.0 | 92.209 |
| 1368.0 | 92.205 |
| 1367.0 | 92.235 |
| 1366.0 | 92.241 |
| 1365.0 | 92.221 |
| 1364.0 | 92.236 |
| 1363.0 | 92.259 |
| 1362.0 | 92.252 |
| 1361.0 | 92.232 |
| 1360.0 | 92.268 |
| 1359.0 | 92.294 |
| 1358.0 | 92.28 |
| 1357.0 | 92.297 |
| 1356.0 | 92.318 |
| 1355.0 | 92.338 |
| 1354.0 | 92.349 |
| 1353.0 | 92.346 |
| 1352.0 | 92.354 |
| 1351.0 | 92.345 |
| 1350.0 | 92.402 |
| 1349.0 | 92.418 |
| 1348.0 | 92.439 |
| 1347.0 | 92.464 |
| 1346.0 | 92.455 |
| 1345.0 | 92.457 |
| 1344.0 | 92.449 |
| 1343.0 | 92.435 |
| 1342.0 | 92.486 |
| 1341.0 | 92.472 |
| 1340.0 | 92.477 |
| 1339.0 | 92.481 |
| 1338.0 | 92.496 |
| 1337.0 | 92.498 |
| 1336.0 | 92.507 |
| 1335.0 | 92.521 |
| 1334.0 | 92.498 |
| 1333.0 | 92.494 |
| 1332.0 | 92.5 |
| 1331.0 | 92.495 |
| 1330.0 | 92.51 |
| 1329.0 | 92.516 |
| 1328.0 | 92.527 |
| 1327.0 | 92.53 |
| 1326.0 | 92.526 |
| 1325.0 | 92.522 |
| 1324.0 | 92.517 |
| 1323.0 | 92.516 |
| 1322.0 | 92.522 |
| 1321.0 | 92.517 |
| 1320.0 | 92.526 |
| 1319.0 | 92.536 |
| 1318.0 | 92.531 |
| 1317.0 | 92.543 |
| 1316.0 | 92.542 |
| 1315.0 | 92.545 |
| 1314.0 | 92.537 |
| 1313.0 | 92.544 |
| 1312.0 | 92.533 |
| 1311.0 | 92.525 |
| 1310.0 | 92.536 |
| 1309.0 | 92.549 |
| 1308.0 | 92.551 |
| 1307.0 | 92.524 |
| 1306.0 | 92.503 |
| 1305.0 | 92.503 |
| 1304.0 | 92.508 |
| 1303.0 | 92.517 |
| 1302.0 | 92.544 |
| 1301.0 | 92.562 |
| 1300.0 | 92.548 |
| 1299.0 | 92.521 |
| 1298.0 | 92.517 |
| 1297.0 | 92.511 |
| 1296.0 | 92.49 |
| 1295.0 | 92.516 |
| 1294.0 | 92.545 |
| 1293.0 | 92.527 |
| 1292.0 | 92.521 |
| 1291.0 | 92.52 |
| 1290.0 | 92.507 |
| 1289.0 | 92.511 |
| 1288.0 | 92.528 |
| 1287.0 | 92.528 |
| 1286.0 | 92.511 |
| 1285.0 | 92.51 |
| 1284.0 | 92.505 |
| 1283.0 | 92.511 |
| 1282.0 | 92.525 |
| 1281.0 | 92.526 |
| 1280.0 | 92.521 |
| 1279.0 | 92.511 |
| 1278.0 | 92.508 |
| 1277.0 | 92.5 |
| 1276.0 | 92.497 |
| 1275.0 | 92.488 |
| 1274.0 | 92.476 |
| 1273.0 | 92.48 |
| 1272.0 | 92.478 |
| 1271.0 | 92.459 |
| 1270.0 | 92.451 |
| 1269.0 | 92.458 |
| 1268.0 | 92.456 |
| 1267.0 | 92.457 |
| 1266.0 | 92.476 |
| 1265.0 | 92.496 |
| 1264.0 | 92.502 |
| 1263.0 | 92.489 |
| 1262.0 | 92.477 |
| 1261.0 | 92.471 |
| 1260.0 | 92.464 |
| 1259.0 | 92.473 |
| 1258.0 | 92.468 |
| 1257.0 | 92.44 |
| 1256.0 | 92.436 |
| 1255.0 | 92.457 |
| 1254.0 | 92.462 |
| 1253.0 | 92.457 |
| 1252.0 | 92.459 |
| 1251.0 | 92.432 |
| 1250.0 | 92.425 |
| 1249.0 | 92.447 |
| 1248.0 | 92.437 |
| 1247.0 | 92.436 |
| 1246.0 | 92.436 |
| 1245.0 | 92.436 |
| 1244.0 | 92.442 |
| 1243.0 | 92.444 |
| 1242.0 | 92.449 |
| 1241.0 | 92.442 |
| 1240.0 | 92.447 |
| 1239.0 | 92.432 |
| 1238.0 | 92.418 |
| 1237.0 | 92.409 |
| 1236.0 | 92.406 |
| 1235.0 | 92.404 |
| 1234.0 | 92.391 |
| 1233.0 | 92.395 |
| 1232.0 | 92.398 |
| 1231.0 | 92.384 |
| 1230.0 | 92.368 |
| 1229.0 | 92.363 |
| 1228.0 | 92.38 |
| 1227.0 | 92.344 |
| 1226.0 | 92.334 |
| 1225.0 | 92.348 |
| 1224.0 | 92.347 |
| 1223.0 | 92.348 |
| 1222.0 | 92.338 |
| 1221.0 | 92.343 |
| 1220.0 | 92.34 |
| 1219.0 | 92.304 |
| 1218.0 | 92.286 |
| 1217.0 | 92.275 |
| 1216.0 | 92.28 |
| 1215.0 | 92.302 |
| 1214.0 | 92.314 |
| 1213.0 | 92.299 |
| 1212.0 | 92.3 |
| 1211.0 | 92.293 |
| 1210.0 | 92.288 |
| 1209.0 | 92.265 |
| 1208.0 | 92.26 |
| 1207.0 | 92.259 |
| 1206.0 | 92.237 |
| 1205.0 | 92.209 |
| 1204.0 | 92.181 |
| 1203.0 | 92.186 |
| 1202.0 | 92.147 |
| 1201.0 | 92.115 |
| 1200.0 | 92.115 |
| 1199.0 | 92.107 |
| 1198.0 | 92.086 |
| 1197.0 | 92.074 |
| 1196.0 | 92.052 |
| 1195.0 | 92.037 |
| 1194.0 | 92.029 |
| 1193.0 | 92.029 |
| 1192.0 | 92.001 |
| 1191.0 | 91.998 |
| 1190.0 | 92.011 |
| 1189.0 | 91.985 |
| 1188.0 | 91.968 |
| 1187.0 | 91.958 |
| 1186.0 | 91.966 |
| 1185.0 | 91.968 |
| 1184.0 | 91.98 |
| 1183.0 | 91.974 |
| 1182.0 | 91.988 |
| 1181.0 | 92.001 |
| 1180.0 | 91.991 |
| 1179.0 | 92.007 |
| 1178.0 | 92.047 |
| 1177.0 | 92.066 |
| 1176.0 | 92.055 |
| 1175.0 | 92.087 |
| 1174.0 | 92.106 |
| 1173.0 | 92.105 |
| 1172.0 | 92.118 |
| 1171.0 | 92.15 |
| 1170.0 | 92.159 |
| 1169.0 | 92.178 |
| 1168.0 | 92.191 |
| 1167.0 | 92.193 |
| 1166.0 | 92.217 |
| 1165.0 | 92.226 |
| 1164.0 | 92.217 |
| 1163.0 | 92.215 |
| 1162.0 | 92.235 |
| 1161.0 | 92.256 |
| 1160.0 | 92.278 |
| 1159.0 | 92.271 |
| 1158.0 | 92.264 |
| 1157.0 | 92.311 |
| 1156.0 | 92.344 |
| 1155.0 | 92.325 |
| 1154.0 | 92.334 |
| 1153.0 | 92.343 |
| 1152.0 | 92.34 |
| 1151.0 | 92.353 |
| 1150.0 | 92.341 |
| 1149.0 | 92.342 |
| 1148.0 | 92.346 |
| 1147.0 | 92.334 |
| 1146.0 | 92.338 |
| 1145.0 | 92.35 |
| 1144.0 | 92.378 |
| 1143.0 | 92.399 |
| 1142.0 | 92.38 |
| 1141.0 | 92.387 |
| 1140.0 | 92.399 |
| 1139.0 | 92.412 |
| 1138.0 | 92.409 |
| 1137.0 | 92.426 |
| 1136.0 | 92.392 |
| 1135.0 | 92.421 |
| 1134.0 | 92.394 |
| 1133.0 | 92.421 |
| 1132.0 | 92.415 |
| 1131.0 | 92.422 |
| 1130.0 | 92.451 |
| 1129.0 | 92.449 |
| 1128.0 | 92.44 |
| 1127.0 | 92.463 |
| 1126.0 | 92.456 |
| 1125.0 | 92.456 |
| 1124.0 | 92.449 |
| 1123.0 | 92.475 |
| 1122.0 | 92.443 |
| 1121.0 | 92.473 |
| 1120.0 | 92.457 |
| 1119.0 | 92.461 |
| 1118.0 | 92.444 |
| 1117.0 | 92.443 |
| 1116.0 | 92.454 |
| 1115.0 | 92.444 |
| 1114.0 | 92.458 |
| 1113.0 | 92.444 |
| 1112.0 | 92.419 |
| 1111.0 | 92.441 |
| 1110.0 | 92.447 |
| 1109.0 | 92.444 |
| 1108.0 | 92.431 |
| 1107.0 | 92.431 |
| 1106.0 | 92.454 |
| 1105.0 | 92.485 |
| 1104.0 | 92.485 |
| 1103.0 | 92.507 |
| 1102.0 | 92.47 |
| 1101.0 | 92.492 |
| 1100.0 | 92.484 |
| 1099.0 | 92.485 |
| 1098.0 | 92.476 |
| 1097.0 | 92.455 |
| 1096.0 | 92.492 |
| 1095.0 | 92.458 |
| 1094.0 | 92.475 |
| 1093.0 | 92.475 |
| 1092.0 | 92.483 |
| 1091.0 | 92.446 |
| 1090.0 | 92.443 |
| 1089.0 | 92.448 |
| 1088.0 | 92.467 |
| 1087.0 | 92.495 |
| 1086.0 | 92.49 |
| 1085.0 | 92.503 |
| 1084.0 | 92.498 |
| 1083.0 | 92.515 |
| 1082.0 | 92.475 |
| 1081.0 | 92.48 |
| 1080.0 | 92.481 |
| 1079.0 | 92.48 |
| 1078.0 | 92.495 |
| 1077.0 | 92.491 |
| 1076.0 | 92.457 |
| 1075.0 | 92.435 |
| 1074.0 | 92.482 |
| 1073.0 | 92.503 |
| 1072.0 | 92.479 |
| 1071.0 | 92.487 |
| 1070.0 | 92.507 |
| 1069.0 | 92.483 |
| 1068.0 | 92.475 |
| 1067.0 | 92.479 |
| 1066.0 | 92.481 |
| 1065.0 | 92.503 |
| 1064.0 | 92.494 |
| 1063.0 | 92.472 |
| 1062.0 | 92.489 |
| 1061.0 | 92.487 |
| 1060.0 | 92.474 |
| 1059.0 | 92.453 |
| 1058.0 | 92.459 |
| 1057.0 | 92.496 |
| 1056.0 | 92.454 |
| 1055.0 | 92.447 |
| 1054.0 | 92.499 |
| 1053.0 | 92.445 |
| 1052.0 | 92.457 |
| 1051.0 | 92.474 |
| 1050.0 | 92.44 |
| 1049.0 | 92.459 |
| 1048.0 | 92.442 |
| 1047.0 | 92.469 |
| 1046.0 | 92.429 |
| 1045.0 | 92.46 |
| 1044.0 | 92.452 |
| 1043.0 | 92.449 |
| 1042.0 | 92.424 |
| 1041.0 | 92.436 |
| 1040.0 | 92.435 |
| 1039.0 | 92.439 |
| 1038.0 | 92.433 |
| 1037.0 | 92.446 |
| 1036.0 | 92.467 |
| 1035.0 | 92.438 |
| 1034.0 | 92.432 |
| 1033.0 | 92.437 |
| 1032.0 | 92.436 |
| 1031.0 | 92.428 |
| 1030.0 | 92.445 |
| 1029.0 | 92.449 |
| 1028.0 | 92.447 |
| 1027.0 | 92.429 |
| 1026.0 | 92.399 |
| 1025.0 | 92.434 |
| 1024.0 | 92.426 |
| 1023.0 | 92.46 |
| 1022.0 | 92.426 |
| 1021.0 | 92.408 |
| 1020.0 | 92.447 |
| 1019.0 | 92.426 |
| 1018.0 | 92.437 |
| 1017.0 | 92.417 |
| 1016.0 | 92.425 |
| 1015.0 | 92.422 |
| 1014.0 | 92.429 |
| 1013.0 | 92.425 |
| 1012.0 | 92.435 |
| 1011.0 | 92.398 |
| 1010.0 | 92.396 |
| 1009.0 | 92.421 |
| 1008.0 | 92.413 |
| 1007.0 | 92.421 |
| 1006.0 | 92.417 |
| 1005.0 | 92.444 |
| 1004.0 | 92.42 |
| 1003.0 | 92.421 |
| 1002.0 | 92.445 |
| 1001.0 | 92.407 |
| 1000.0 | 92.425 |
| 999.0 | 92.42 |
| 998.0 | 92.425 |
| 997.0 | 92.443 |
| 996.0 | 92.404 |
| 995.0 | 92.417 |
| 994.0 | 92.4 |
| 993.0 | 92.389 |
| 992.0 | 92.402 |
| 991.0 | 92.392 |
| 990.0 | 92.414 |
| 989.0 | 92.407 |
| 988.0 | 92.416 |
| 987.0 | 92.428 |
| 986.0 | 92.423 |
| 985.0 | 92.441 |
| 984.0 | 92.427 |
| 983.0 | 92.395 |
| 982.0 | 92.423 |
| 981.0 | 92.43 |
| 980.0 | 92.434 |
| 979.0 | 92.415 |
| 978.0 | 92.392 |
| 977.0 | 92.395 |
| 976.0 | 92.421 |
| 975.0 | 92.4 |
| 974.0 | 92.428 |
| 973.0 | 92.437 |
| 972.0 | 92.444 |
| 971.0 | 92.424 |
| 970.0 | 92.407 |
| 969.0 | 92.417 |
| 968.0 | 92.417 |
| 967.0 | 92.417 |
| 966.0 | 92.438 |
| 965.0 | 92.433 |
| 964.0 | 92.45 |
| 963.0 | 92.472 |
| 962.0 | 92.452 |
| 961.0 | 92.44 |
| 960.0 | 92.435 |
| 959.0 | 92.445 |
| 958.0 | 92.458 |
| 957.0 | 92.435 |
| 956.0 | 92.421 |
| 955.0 | 92.402 |
| 954.0 | 92.412 |
| 953.0 | 92.421 |
| 952.0 | 92.443 |
| 951.0 | 92.465 |
| 950.0 | 92.455 |
| 949.0 | 92.464 |
| 948.0 | 92.448 |
| 947.0 | 92.448 |
| 946.0 | 92.448 |
| 945.0 | 92.42 |
| 944.0 | 92.411 |
| 943.0 | 92.436 |
| 942.0 | 92.434 |
| 941.0 | 92.425 |
| 940.0 | 92.444 |
| 939.0 | 92.457 |
| 938.0 | 92.444 |
| 937.0 | 92.424 |
| 936.0 | 92.458 |
| 935.0 | 92.45 |
| 934.0 | 92.405 |
| 933.0 | 92.405 |
| 932.0 | 92.404 |
| 931.0 | 92.37 |
| 930.0 | 92.367 |
| 929.0 | 92.409 |
| 928.0 | 92.418 |
| 927.0 | 92.393 |
| 926.0 | 92.393 |
| 925.0 | 92.399 |
| 924.0 | 92.367 |
| 923.0 | 92.365 |
| 922.0 | 92.36 |
| 921.0 | 92.349 |
| 920.0 | 92.357 |
| 919.0 | 92.376 |
| 918.0 | 92.355 |
| 917.0 | 92.328 |
| 916.0 | 92.354 |
| 915.0 | 92.377 |
| 914.0 | 92.328 |
| 913.0 | 92.339 |
| 912.0 | 92.358 |
| 911.0 | 92.336 |
| 910.0 | 92.345 |
| 909.0 | 92.368 |
| 908.0 | 92.345 |
| 907.0 | 92.311 |
| 906.0 | 92.332 |
| 905.0 | 92.325 |
| 904.0 | 92.291 |
| 903.0 | 92.29 |
| 902.0 | 92.265 |
| 901.0 | 92.28 |
| 900.0 | 92.284 |
| 899.0 | 92.245 |
| 898.0 | 92.222 |
| 897.0 | 92.236 |
| 896.0 | 92.256 |
| 895.0 | 92.229 |
| 894.0 | 92.204 |
| 893.0 | 92.204 |
| 892.0 | 92.199 |
| 891.0 | 92.227 |
| 890.0 | 92.24 |
| 889.0 | 92.228 |
| 888.0 | 92.203 |
| 887.0 | 92.21 |
| 886.0 | 92.214 |
| 885.0 | 92.192 |
| 884.0 | 92.179 |
| 883.0 | 92.193 |
| 882.0 | 92.225 |
| 881.0 | 92.232 |
| 880.0 | 92.232 |
| 879.0 | 92.242 |
| 878.0 | 92.224 |
| 877.0 | 92.201 |
| 876.0 | 92.227 |
| 875.0 | 92.246 |
| 874.0 | 92.237 |
| 873.0 | 92.231 |
| 872.0 | 92.241 |
| 871.0 | 92.251 |
| 870.0 | 92.268 |
| 869.0 | 92.279 |
| 868.0 | 92.276 |
| 867.0 | 92.288 |
| 866.0 | 92.291 |
| 865.0 | 92.306 |
| 864.0 | 92.301 |
| 863.0 | 92.292 |
| 862.0 | 92.314 |
| 861.0 | 92.292 |
| 860.0 | 92.146 |
| 859.0 | 92.029 |
| 858.0 | 91.982 |
| 857.0 | 91.986 |
| 856.0 | 91.985 |
| 855.0 | 91.943 |
| 854.0 | 91.879 |
| 853.0 | 91.873 |
| 852.0 | 91.856 |
| 851.0 | 91.828 |
| 850.0 | 91.766 |
| 849.0 | 91.749 |
| 848.0 | 91.744 |
| 847.0 | 91.753 |
| 846.0 | 91.766 |
| 845.0 | 91.797 |
| 844.0 | 91.793 |
| 843.0 | 91.79 |
| 842.0 | 91.822 |
| 841.0 | 91.872 |
| 840.0 | 91.929 |
| 839.0 | 91.95 |
| 838.0 | 91.929 |
| 837.0 | 91.972 |
| 836.0 | 92.054 |
| 835.0 | 92.079 |
| 834.0 | 92.118 |
| 833.0 | 92.188 |
| 832.0 | 92.178 |
| 831.0 | 92.184 |
| 830.0 | 92.193 |
| 829.0 | 92.164 |
| 828.0 | 92.176 |
| 827.0 | 92.156 |
| 826.0 | 92.097 |
| 825.0 | 92.03 |
| 824.0 | 91.995 |
| 823.0 | 91.925 |
| 822.0 | 91.883 |
| 821.0 | 91.843 |
| 820.0 | 91.73 |
| 819.0 | 91.633 |
| 818.0 | 91.568 |
| 817.0 | 91.484 |
| 816.0 | 91.426 |
| 815.0 | 91.369 |
| 814.0 | 91.262 |
| 813.0 | 91.244 |
| 812.0 | 91.221 |
| 811.0 | 91.193 |
| 810.0 | 91.146 |
| 809.0 | 91.144 |
| 808.0 | 91.133 |
| 807.0 | 91.155 |
| 806.0 | 91.198 |
| 805.0 | 91.188 |
| 804.0 | 91.268 |
| 803.0 | 91.33 |
| 802.0 | 91.387 |
| 801.0 | 91.46 |
| 800.0 | 91.568 |
| 799.0 | 91.587 |
| 798.0 | 91.708 |
| 797.0 | 91.829 |
| 796.0 | 91.881 |
| 795.0 | 91.966 |
| 794.0 | 92.076 |
| 793.0 | 92.09 |
| 792.0 | 92.141 |
| 791.0 | 92.198 |
| 790.0 | 92.225 |
| 789.0 | 92.263 |
| 788.0 | 92.296 |
| 787.0 | 92.279 |
| 786.0 | 92.288 |
| 785.0 | 92.258 |
| 784.0 | 92.2 |
| 783.0 | 92.213 |
| 782.0 | 92.192 |
| 781.0 | 92.139 |
| 780.0 | 92.114 |
| 779.0 | 92.11 |
| 778.0 | 92.07 |
| 777.0 | 92.053 |
| 776.0 | 92.05 |
| 775.0 | 91.999 |
| 774.0 | 92.007 |
| 773.0 | 92.017 |
| 772.0 | 92.042 |
| 771.0 | 92.063 |
| 770.0 | 92.093 |
| 769.0 | 92.098 |
| 768.0 | 92.149 |
| 767.0 | 92.173 |
| 766.0 | 92.184 |
| 765.0 | 92.241 |
| 764.0 | 92.3 |
| 763.0 | 92.252 |
| 762.0 | 92.275 |
| 761.0 | 92.299 |
| 760.0 | 92.302 |
| 759.0 | 92.318 |
| 758.0 | 92.289 |
| 757.0 | 92.214 |
| 756.0 | 92.183 |
| 755.0 | 92.139 |
| 754.0 | 92.069 |
| 753.0 | 92.012 |
| 752.0 | 91.941 |
| 751.0 | 91.832 |
| 750.0 | 91.743 |
| 749.0 | 91.733 |
| 748.0 | 91.661 |
| 747.0 | 91.598 |
| 746.0 | 91.553 |
| 745.0 | 91.459 |
| 744.0 | 91.447 |
| 743.0 | 91.465 |
| 742.0 | 91.462 |
| 741.0 | 91.5 |
| 740.0 | 91.506 |
| 739.0 | 91.519 |
| 738.0 | 91.581 |
| 737.0 | 91.666 |
| 736.0 | 91.729 |
| 735.0 | 91.824 |
| 734.0 | 91.902 |
| 733.0 | 91.912 |
| 732.0 | 92.007 |
| 731.0 | 92.116 |
| 730.0 | 92.155 |
| 729.0 | 92.233 |
| 728.0 | 92.282 |
| 727.0 | 92.298 |
| 726.0 | 92.307 |
| 725.0 | 92.343 |
| 724.0 | 92.357 |
| 723.0 | 92.36 |
| 722.0 | 92.34 |
| 721.0 | 92.3 |
| 720.0 | 92.286 |
| 719.0 | 92.252 |
| 718.0 | 92.227 |
| 717.0 | 92.216 |
| 716.0 | 92.212 |
| 715.0 | 92.13 |
| 714.0 | 92.135 |
| 713.0 | 92.132 |
| 712.0 | 92.158 |
| 711.0 | 92.201 |
| 710.0 | 92.204 |
| 709.0 | 92.22 |
| 708.0 | 92.225 |
| 707.0 | 92.298 |
| 706.0 | 92.295 |
| 705.0 | 92.373 |
| 704.0 | 92.385 |
| 703.0 | 92.382 |
| 702.0 | 92.366 |
| 701.0 | 92.349 |
| 700.0 | 92.366 |
| 699.0 | 92.354 |
| 698.0 | 92.275 |
| 697.0 | 92.22 |
| 696.0 | 92.156 |
| 695.0 | 92.104 |
| 694.0 | 92.043 |
| 693.0 | 91.978 |
| 692.0 | 91.909 |
| 691.0 | 91.852 |
| 690.0 | 91.797 |
| 689.0 | 91.727 |
| 688.0 | 91.701 |
| 687.0 | 91.71 |
| 686.0 | 91.694 |
| 685.0 | 91.724 |
| 684.0 | 91.705 |
| 683.0 | 91.806 |
| 682.0 | 91.873 |
| 681.0 | 91.951 |
| 680.0 | 92.032 |
| 679.0 | 92.088 |
| 678.0 | 92.152 |
| 677.0 | 92.222 |
| 676.0 | 92.306 |
| 675.0 | 92.389 |
| 674.0 | 92.394 |
| 673.0 | 92.421 |
| 672.0 | 92.429 |
| 671.0 | 92.442 |
| 670.0 | 92.451 |
| 669.0 | 92.422 |
| 668.0 | 92.373 |
| 667.0 | 92.337 |
| 666.0 | 92.258 |
| 665.0 | 92.264 |
| 664.0 | 92.271 |
| 663.0 | 92.309 |
| 662.0 | 92.255 |
| 661.0 | 92.263 |
| 660.0 | 92.233 |
| 659.0 | 92.295 |
| 658.0 | 92.325 |
| 657.0 | 92.387 |
| 656.0 | 92.401 |
| 655.0 | 92.385 |
| 654.0 | 92.413 |
| 653.0 | 92.446 |
| 652.0 | 92.446 |
| 651.0 | 92.466 |
| 650.0 | 92.43 |
| 649.0 | 92.368 |
| 648.0 | 92.293 |
| 647.0 | 92.261 |
| 646.0 | 92.187 |
| 645.0 | 92.14 |
| 644.0 | 92.036 |
| 643.0 | 91.971 |
| 642.0 | 91.866 |
| 641.0 | 91.861 |
| 640.0 | 91.841 |
| 639.0 | 91.876 |
| 638.0 | 91.868 |
| 637.0 | 91.89 |
| 636.0 | 91.921 |
| 635.0 | 92.012 |
| 634.0 | 92.095 |
| 633.0 | 92.174 |
| 632.0 | 92.237 |
| 631.0 | 92.304 |
| 630.0 | 92.36 |
| 629.0 | 92.424 |
| 628.0 | 92.474 |
| 627.0 | 92.513 |
| 626.0 | 92.475 |
| 625.0 | 92.451 |
| 624.0 | 92.435 |
| 623.0 | 92.431 |
| 622.0 | 92.395 |
| 621.0 | 92.356 |
| 620.0 | 92.312 |
| 619.0 | 92.304 |
| 618.0 | 92.258 |
| 617.0 | 92.289 |
| 616.0 | 92.313 |
| 615.0 | 92.365 |
| 614.0 | 92.37 |
| 613.0 | 92.421 |
| 612.0 | 92.421 |
| 611.0 | 92.451 |
| 610.0 | 92.487 |
| 609.0 | 92.478 |
| 608.0 | 92.436 |
| 607.0 | 92.409 |
| 606.0 | 92.295 |
| 605.0 | 92.259 |
| 604.0 | 92.209 |
| 603.0 | 92.108 |
| 602.0 | 92.013 |
| 601.0 | 91.994 |
| 600.0 | 91.89 |
| 599.0 | 91.898 |
| 598.0 | 91.914 |
| 597.0 | 91.923 |
| 596.0 | 91.948 |
| 595.0 | 92.015 |
| 594.0 | 92.082 |
| 593.0 | 92.183 |
| 592.0 | 92.284 |
| 591.0 | 92.346 |
| 590.0 | 92.382 |
| 589.0 | 92.433 |
| 588.0 | 92.445 |
| 587.0 | 92.463 |
| 586.0 | 92.459 |
| 585.0 | 92.429 |
| 584.0 | 92.376 |
| 583.0 | 92.346 |
| 582.0 | 92.283 |
| 581.0 | 92.273 |
| 580.0 | 92.283 |
| 579.0 | 92.294 |
| 578.0 | 92.296 |
| 577.0 | 92.332 |
| 576.0 | 92.356 |
| 575.0 | 92.424 |
| 574.0 | 92.451 |
| 573.0 | 92.473 |
| 572.0 | 92.443 |
| 571.0 | 92.397 |
| 570.0 | 92.314 |
| 569.0 | 92.274 |
| 568.0 | 92.191 |
| 567.0 | 92.108 |
| 566.0 | 92.005 |
| 565.0 | 91.946 |
| 564.0 | 91.87 |
| 563.0 | 91.87 |
| 562.0 | 91.886 |
| 561.0 | 91.923 |
| 560.0 | 92.016 |
| 559.0 | 92.103 |
| 558.0 | 92.177 |
| 557.0 | 92.285 |
| 556.0 | 92.352 |
| 555.0 | 92.428 |
| 554.0 | 92.467 |
| 553.0 | 92.474 |
| 552.0 | 92.434 |
| 551.0 | 92.39 |
| 550.0 | 92.321 |
| 549.0 | 92.306 |
| 548.0 | 92.294 |
| 547.0 | 92.279 |
| 546.0 | 92.254 |
| 545.0 | 92.268 |
| 544.0 | 92.289 |
| 543.0 | 92.363 |
| 542.0 | 92.413 |
| 541.0 | 92.434 |
| 540.0 | 92.417 |
| 539.0 | 92.377 |
| 538.0 | 92.294 |
| 537.0 | 92.234 |
| 536.0 | 92.13 |
| 535.0 | 92.024 |
| 534.0 | 91.921 |
| 533.0 | 91.839 |
| 532.0 | 91.797 |
| 531.0 | 91.834 |
| 530.0 | 91.886 |
| 529.0 | 91.965 |
| 528.0 | 92.065 |
| 527.0 | 92.182 |
| 526.0 | 92.277 |
| 525.0 | 92.378 |
| 524.0 | 92.432 |
| 523.0 | 92.429 |
| 522.0 | 92.396 |
| 521.0 | 92.341 |
| 520.0 | 92.264 |
| 519.0 | 92.242 |
| 518.0 | 92.223 |
| 517.0 | 92.208 |
| 516.0 | 92.233 |
| 515.0 | 92.265 |
| 514.0 | 92.315 |
| 513.0 | 92.384 |
| 512.0 | 92.397 |
| 511.0 | 92.371 |
| 510.0 | 92.291 |
| 509.0 | 92.192 |
| 508.0 | 92.07 |
| 507.0 | 91.959 |
| 506.0 | 91.864 |
| 505.0 | 91.809 |
| 504.0 | 91.797 |
| 503.0 | 91.837 |
| 502.0 | 91.923 |
| 501.0 | 92.047 |
| 500.0 | 92.171 |
| 499.0 | 92.251 |
| 498.0 | 92.294 |
| 497.0 | 92.295 |
| 496.0 | 92.269 |
| 495.0 | 92.237 |
| 494.0 | 92.182 |
| 493.0 | 92.138 |
| 492.0 | 92.124 |
| 491.0 | 92.119 |
| 490.0 | 92.147 |
| 489.0 | 92.183 |
| 488.0 | 92.233 |
| 487.0 | 92.272 |
| 486.0 | 92.249 |
| 485.0 | 92.183 |
| 484.0 | 92.099 |
| 483.0 | 91.981 |
| 482.0 | 91.869 |
| 481.0 | 91.82 |
| 480.0 | 91.755 |
| 479.0 | 91.752 |
| 478.0 | 91.858 |
| 477.0 | 91.958 |
| 476.0 | 92.074 |
| 475.0 | 92.202 |
| 474.0 | 92.222 |
| 473.0 | 92.198 |
| 472.0 | 92.171 |
| 471.0 | 92.077 |
| 470.0 | 92.011 |
| 469.0 | 92.015 |
| 468.0 | 91.978 |
| 467.0 | 91.987 |
| 466.0 | 92.068 |
| 465.0 | 92.091 |
| 464.0 | 92.103 |
| 463.0 | 92.106 |
| 462.0 | 91.983 |
| 461.0 | 91.856 |
| 460.0 | 91.789 |
| 459.0 | 91.707 |
| 458.0 | 91.696 |
| 457.0 | 91.755 |
| 456.0 | 91.796 |
| 455.0 | 91.85 |
| 454.0 | 91.924 |
| 453.0 | 91.943 |
| 452.0 | 91.938 |
| 451.0 | 91.924 |
| 450.0 | 91.81 |
| 449.0 | 91.748 |
| 448.0 | 91.722 |
| 447.0 | 91.689 |
| 446.0 | 91.729 |
| 445.0 | 91.783 |
| 444.0 | 91.762 |
| 443.0 | 91.72 |
| 442.0 | 91.668 |
| 441.0 | 91.557 |
| 440.0 | 91.474 |
| 439.0 | 91.454 |
| 438.0 | 91.359 |
| 437.0 | 91.37 |
| 436.0 | 91.432 |
| 435.0 | 91.429 |
| 434.0 | 91.423 |
| 433.0 | 91.388 |
| 432.0 | 91.278 |
| 431.0 | 91.157 |
| 430.0 | 91.091 |
| 429.0 | 91.021 |
| 428.0 | 90.98 |
| 427.0 | 90.952 |
| 426.0 | 90.927 |
| 425.0 | 90.823 |
| 424.0 | 90.69 |
| 423.0 | 90.506 |
| 422.0 | 90.345 |
| 421.0 | 90.199 |
| 420.0 | 90.062 |
| 419.0 | 89.979 |
| 418.0 | 89.932 |
| 417.0 | 89.796 |
| 416.0 | 89.614 |
| 415.0 | 89.397 |
| 414.0 | 89.106 |
| 413.0 | 88.861 |
| 412.0 | 88.655 |
| 411.0 | 88.434 |
| 410.0 | 88.2 |
| 409.0 | 87.933 |
| 408.0 | 87.582 |
| 407.0 | 87.171 |
| 406.0 | 86.76 |
| 405.0 | 86.331 |
| 404.0 | 85.953 |
| 403.0 | 85.621 |
| 402.0 | 85.21 |
| 401.0 | 84.747 |
| 400.0 | 84.233 |
| 399.0 | 83.602 |
| 398.0 | 82.974 |
| 397.0 | 82.394 |
| 396.0 | 81.793 |
| 395.0 | 81.177 |
| 394.0 | 80.523 |
| 393.0 | 79.766 |
| 392.0 | 78.987 |
| 391.0 | 78.193 |
| 390.0 | 77.314 |
| 389.0 | 76.485 |
| 388.0 | 75.669 |
| 387.0 | 74.763 |
| 386.0 | 73.816 |
| 385.0 | 72.863 |
| 384.0 | 71.801 |
| 383.0 | 70.761 |
| 382.0 | 69.756 |
| 381.0 | 68.69 |
| 380.0 | 67.576 |
| 379.0 | 66.401 |
| 378.0 | 65.028 |
| 377.0 | 63.792 |
| 376.0 | 62.652 |
| 375.0 | 61.555 |
| 374.0 | 60.42 |
| 373.0 | 59.261 |
| 372.0 | 58.057 |
| 371.0 | 56.821 |
| 370.0 | 55.644 |
| 369.0 | 54.46 |
| 368.0 | 53.295 |
| 367.0 | 52.078 |
| 366.0 | 50.889 |
| 365.0 | 49.726 |
| 364.0 | 48.643 |
| 363.0 | 47.612 |
| 362.0 | 46.606 |
| 361.0 | 45.534 |
| 360.0 | 44.486 |
| 359.0 | 43.461 |
| 358.0 | 42.504 |
| 357.0 | 41.585 |
| 356.0 | 40.668 |
| 355.0 | 39.763 |
| 354.0 | 38.904 |
| 353.0 | 38.067 |
| 352.0 | 37.294 |
| 351.0 | 36.531 |
| 350.0 | 35.775 |
| 349.0 | 35.006 |
| 348.0 | 34.285 |
| 347.0 | 33.628 |
| 346.0 | 33.01 |
| 345.0 | 32.394 |
| 344.0 | 31.835 |
| 343.0 | 31.274 |
| 342.0 | 30.8 |
| 341.0 | 30.337 |
| 340.0 | 29.907 |
| 339.0 | 29.457 |
| 338.0 | 29.055 |
| 337.0 | 28.683 |
| 336.0 | 28.36 |
| 335.0 | 28.034 |
| 334.0 | 27.726 |
| 333.0 | 27.439 |
| 332.0 | 27.196 |
| 331.0 | 26.954 |
| 330.0 | 26.733 |
| 329.0 | 26.512 |
| 328.0 | 26.333 |
| 327.0 | 26.17 |
| 326.0 | 25.998 |
| 325.0 | 25.837 |
| 324.0 | 25.703 |
| 323.0 | 25.57 |
| 322.0 | 25.434 |
| 321.0 | 25.285 |
| 320.0 | 25.138 |
| 319.0 | 24.952 |
| 318.0 | 24.014 |
| 317.0 | 23.711 |
| 316.0 | 23.42 |
| 315.0 | 23.049 |
| 314.0 | 22.588 |
| 313.0 | 21.99 |
| 312.0 | 21.279 |
| 311.0 | 20.411 |
| 310.0 | 19.397 |
| 309.0 | 18.244 |
| 308.0 | 17.046 |
| 307.0 | 15.871 |
| 306.0 | 14.737 |
| 305.0 | 13.69 |
| 304.0 | 12.706 |
| 303.0 | 11.736 |
| 302.0 | 10.782 |
| 301.0 | 9.779 |
| 300.0 | 8.762 |
| 299.0 | 7.74 |
| 298.0 | 6.759 |
| 297.0 | 5.839 |
| 296.0 | 5.022 |
| 295.0 | 4.301 |
| 294.0 | 3.684 |
| 293.0 | 3.157 |
| 292.0 | 2.722 |
| 291.0 | 2.352 |
| 290.0 | 2.031 |
| 289.0 | 1.775 |
| 288.0 | 1.554 |
| 287.0 | 1.357 |
| 286.0 | 1.181 |
| 285.0 | 1.025 |
| 284.0 | 0.883 |
| 283.0 | 0.767 |
| 282.0 | 0.673 |
| 281.0 | 0.588 |
| 280.0 | 0.519 |
| 279.0 | 0.456 |
| 278.0 | 0.394 |
| 277.0 | 0.341 |
| 276.0 | 0.301 |
| 275.0 | 0.251 |
| 274.0 | 0.213 |
| 273.0 | 0.175 |
| 272.0 | 0.143 |
| 271.0 | 0.115 |
| 270.0 | 0.096 |
| 269.0 | 0.07 |
| 268.0 | 0.054 |
| 267.0 | 0.04 |
| 266.0 | 0.024 |
| 265.0 | 0.017 |
| 264.0 | 0.015 |
| 263.0 | 0.009 |
| 262.0 | 0.009 |
| 261.0 | 0.005 |
| 260.0 | 0.002 |
| 259.0 | 0.004 |
| 258.0 | 0.002 |
| 257.0 | 0.003 |
| 256.0 | 0.005 |
| 255.0 | 0.003 |
| 254.0 | 0.001 |
| 253.0 | 0.003 |
| 252.0 | 0 |
| 251.0 | 0.001 |
| 250.0 | 0.003 |
| 249.0 | 0.001 |
| 248.0 | 0.001 |
| 247.0 | 0.001 |
| 246.0 | 0 |
| 245.0 | 0.002 |
| 244.0 | 0.004 |
| 243.0 | 0 |
| 242.0 | 0.001 |
| 241.0 | 0.001 |
| 240.0 | 0.003 |
| 239.0 | 0.002 |
| 238.0 | 0.003 |
| 237.0 | 0.001 |
| 236.0 | 0.002 |
| 235.0 | 0.001 |
| 234.0 | 0.001 |
| 233.0 | 0.001 |
| 232.0 | 0.002 |
| 231.0 | 0.001 |
| 230.0 | 0.001 |
| 229.0 | 0.002 |
| 228.0 | 0.002 |
| 227.0 | 0.001 |
| 226.0 | 0.003 |
| 225.0 | 0.001 |
| 224.0 | 0.003 |
| 223.0 | 0 |
| 222.0 | 0.001 |
| 221.0 | 0.001 |
| 220.0 | 0.002 |
| 219.0 | 0 |
| 218.0 | 0.001 |
| 217.0 | 0.002 |
| 216.0 | 0.003 |
| 215.0 | 0.004 |
| 214.0 | 0.003 |
| 213.0 | 0.002 |
| 212.0 | 0 |
| 211.0 | 0.005 |
| 210.0 | 0.004 |
| 209.0 | 0.004 |
| 208.0 | 0.005 |
| 207.0 | 0.004 |
| 206.0 | 0.005 |
| 205.0 | 0.007 |
| 204.0 | 0.004 |
| 203.0 | 0.005 |
| 202.0 | 0.009 |
| 201.0 | 0.007 |
| 200.0 | 0.007 |